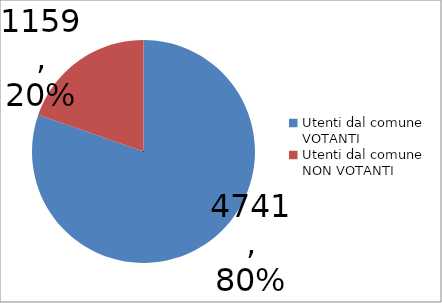
| Category | Series 0 |
|---|---|
| Utenti dal comune VOTANTI | 4741 |
| Utenti dal comune NON VOTANTI | 1159 |